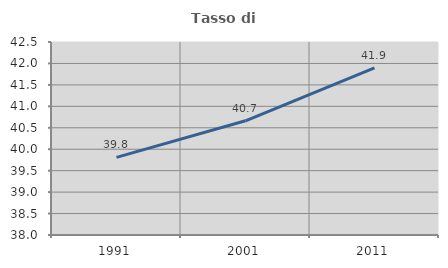
| Category | Tasso di occupazione   |
|---|---|
| 1991.0 | 39.809 |
| 2001.0 | 40.664 |
| 2011.0 | 41.896 |